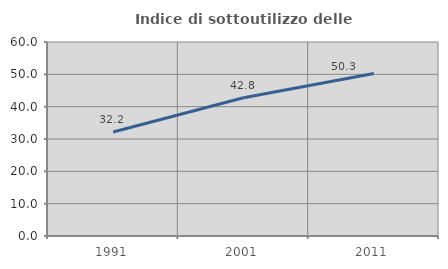
| Category | Indice di sottoutilizzo delle abitazioni  |
|---|---|
| 1991.0 | 32.163 |
| 2001.0 | 42.755 |
| 2011.0 | 50.281 |